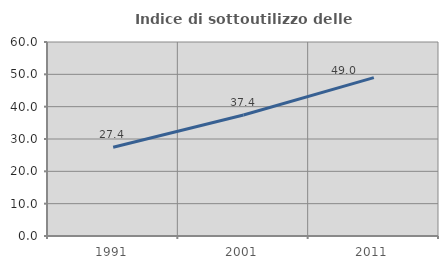
| Category | Indice di sottoutilizzo delle abitazioni  |
|---|---|
| 1991.0 | 27.446 |
| 2001.0 | 37.41 |
| 2011.0 | 48.989 |